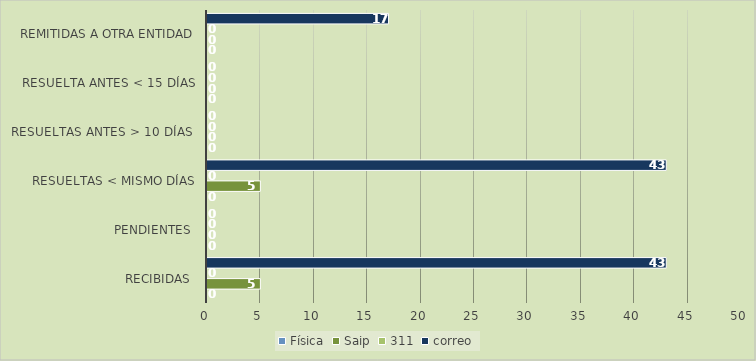
| Category | Física | Saip | 311 | correo |
|---|---|---|---|---|
| Recibidas  | 0 | 5 | 0 | 43 |
| Pendientes  | 0 | 0 | 0 | 0 |
| Resueltas < mismo días | 0 | 5 | 0 | 43 |
| Resueltas antes > 10 días  | 0 | 0 | 0 | 0 |
| Resuelta antes < 15 días | 0 | 0 | 0 | 0 |
| Remitidas a otra entidad | 0 | 0 | 0 | 17 |